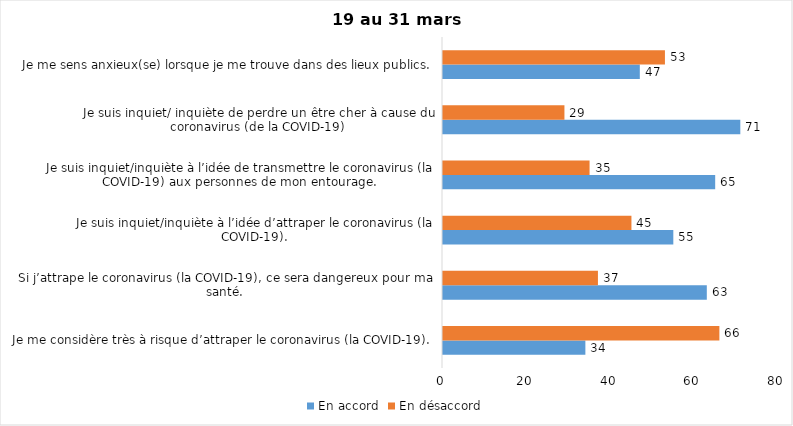
| Category | En accord | En désaccord |
|---|---|---|
| Je me considère très à risque d’attraper le coronavirus (la COVID-19). | 34 | 66 |
| Si j’attrape le coronavirus (la COVID-19), ce sera dangereux pour ma santé. | 63 | 37 |
| Je suis inquiet/inquiète à l’idée d’attraper le coronavirus (la COVID-19). | 55 | 45 |
| Je suis inquiet/inquiète à l’idée de transmettre le coronavirus (la COVID-19) aux personnes de mon entourage. | 65 | 35 |
| Je suis inquiet/ inquiète de perdre un être cher à cause du coronavirus (de la COVID-19) | 71 | 29 |
| Je me sens anxieux(se) lorsque je me trouve dans des lieux publics. | 47 | 53 |